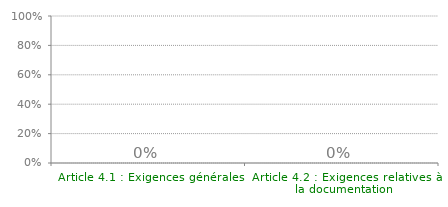
| Category | Article 4 |
|---|---|
| Article 4.1 : Exigences générales | 0 |
| Article 4.2 : Exigences relatives à la documentation | 0 |